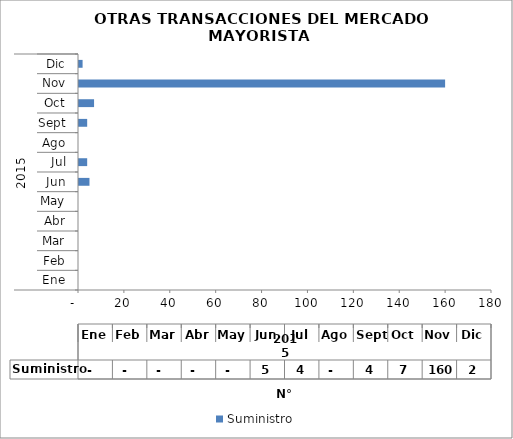
| Category | Suministro |
|---|---|
| 0 | 0 |
| 1 | 0 |
| 2 | 0 |
| 3 | 0 |
| 4 | 0 |
| 5 | 5 |
| 6 | 4 |
| 7 | 0 |
| 8 | 4 |
| 9 | 7 |
| 10 | 160 |
| 11 | 2 |